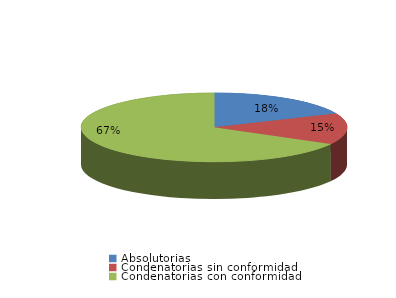
| Category | Series 0 |
|---|---|
| Absolutorias | 40 |
| Condenatorias sin conformidad | 32 |
| Condenatorias con conformidad | 146 |